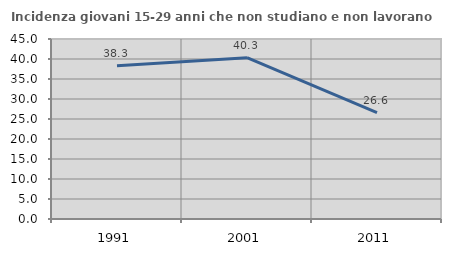
| Category | Incidenza giovani 15-29 anni che non studiano e non lavorano  |
|---|---|
| 1991.0 | 38.312 |
| 2001.0 | 40.342 |
| 2011.0 | 26.599 |